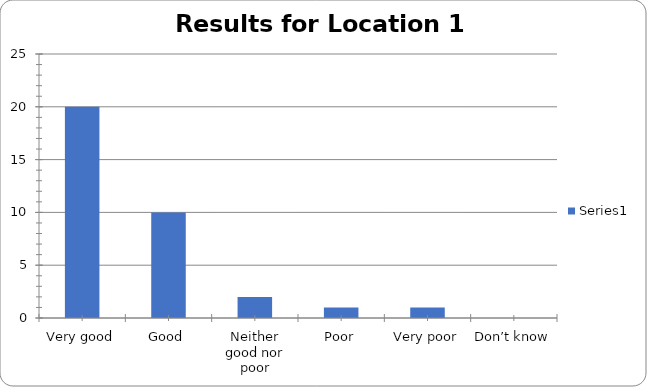
| Category | Series 0 |
|---|---|
| Very good | 20 |
| Good | 10 |
| Neither good nor poor | 2 |
| Poor | 1 |
| Very poor | 1 |
| Don’t know | 0 |